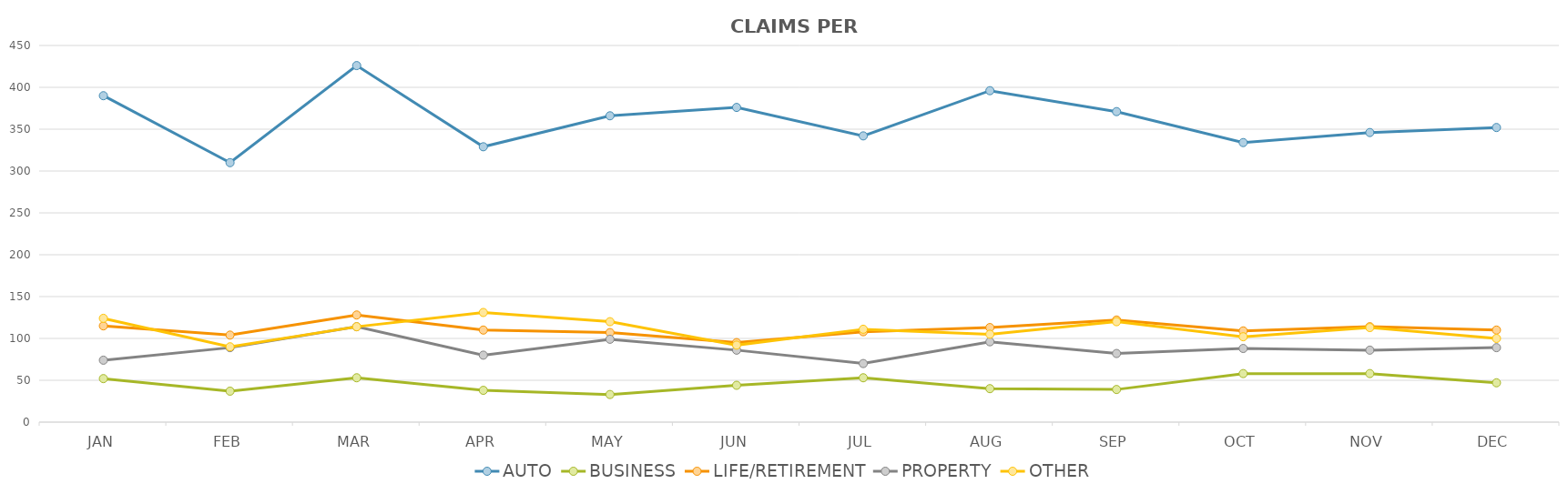
| Category | AUTO | BUSINESS | LIFE/RETIREMENT | PROPERTY | OTHER |
|---|---|---|---|---|---|
| JAN | 390 | 52 | 115 | 74 | 124 |
| FEB | 310 | 37 | 104 | 89 | 90 |
| MAR | 426 | 53 | 128 | 114 | 114 |
| APR | 329 | 38 | 110 | 80 | 131 |
| MAY | 366 | 33 | 107 | 99 | 120 |
| JUN | 376 | 44 | 95 | 86 | 92 |
| JUL | 342 | 53 | 108 | 70 | 111 |
| AUG | 396 | 40 | 113 | 96 | 105 |
| SEP | 371 | 39 | 122 | 82 | 120 |
| OCT | 334 | 58 | 109 | 88 | 102 |
| NOV | 346 | 58 | 114 | 86 | 113 |
| DEC | 352 | 47 | 110 | 89 | 100 |